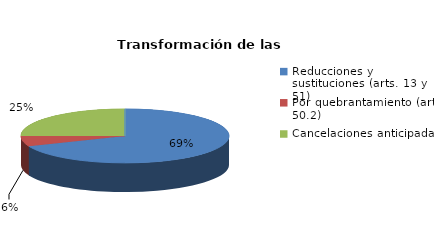
| Category | Series 0 |
|---|---|
| Reducciones y sustituciones (arts. 13 y 51) | 11 |
| Por quebrantamiento (art. 50.2) | 1 |
| Cancelaciones anticipadas | 4 |
| Traslado a Centros Penitenciarios | 0 |
| Conversión internamientos en cerrados (art. 51.2) | 0 |